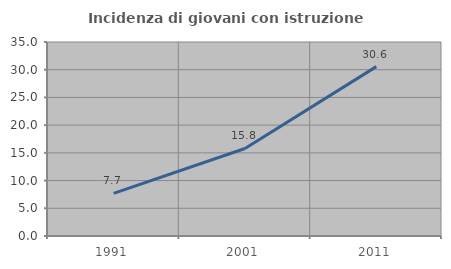
| Category | Incidenza di giovani con istruzione universitaria |
|---|---|
| 1991.0 | 7.692 |
| 2001.0 | 15.789 |
| 2011.0 | 30.556 |